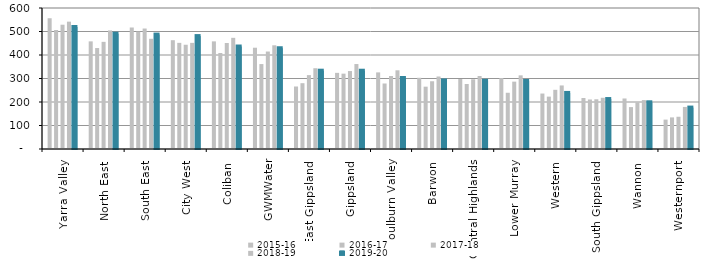
| Category | 2015-16 | 2016-17 | 2017-18 | 2018-19 | 2019-20 |
|---|---|---|---|---|---|
| Yarra Valley  | 556 | 506.42 | 528.88 | 541.881 | 519.241 |
| North East  | 458 | 429.66 | 455.98 | 504.579 | 490.631 |
| South East  | 517 | 499.89 | 512.63 | 469.035 | 486.81 |
| City West  | 463 | 451.64 | 443.6 | 451.666 | 480.467 |
| Coliban  | 458 | 408.57 | 451.08 | 473.053 | 436.124 |
| GWMWater | 431 | 361.39 | 414.75 | 441.313 | 428.725 |
| East Gippsland  | 266 | 280 | 314.37 | 343.732 | 333.188 |
| Gippsland  | 324 | 320.61 | 331.7 | 361.553 | 333.075 |
| Goulburn Valley  | 326 | 278.71 | 310.49 | 334.889 | 302.09 |
| Barwon  | 303 | 265.2 | 288.23 | 308.508 | 291.695 |
| Central Highlands  | 298 | 276.57 | 296.64 | 310.601 | 290.221 |
| Lower Murray  | 302 | 239.29 | 286.65 | 313.392 | 289.567 |
| Western  | 236 | 222.89 | 251.88 | 270.411 | 238.575 |
| South Gippsland  | 217 | 210.71 | 211.6 | 217.925 | 212.578 |
| Wannon  | 215 | 178.31 | 198.4 | 208.09 | 198.738 |
| Westernport  | 125 | 134.49 | 137.27 | 178.976 | 176.249 |